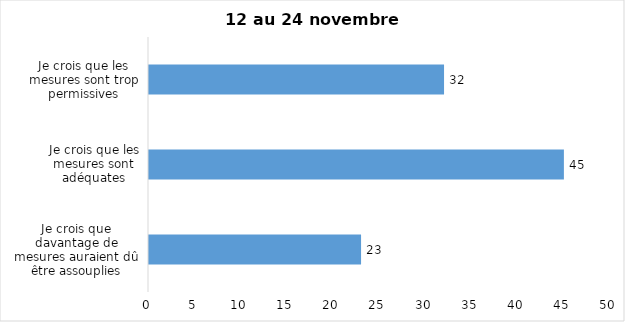
| Category | Series 0 |
|---|---|
| Je crois que davantage de mesures auraient dû être assouplies | 23 |
| Je crois que les mesures sont adéquates | 45 |
| Je crois que les mesures sont trop permissives | 32 |